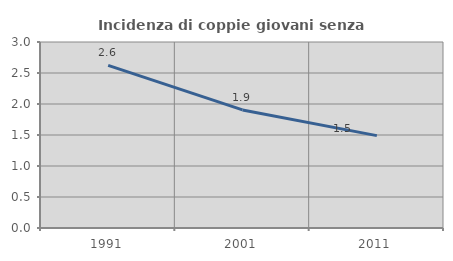
| Category | Incidenza di coppie giovani senza figli |
|---|---|
| 1991.0 | 2.624 |
| 2001.0 | 1.905 |
| 2011.0 | 1.49 |